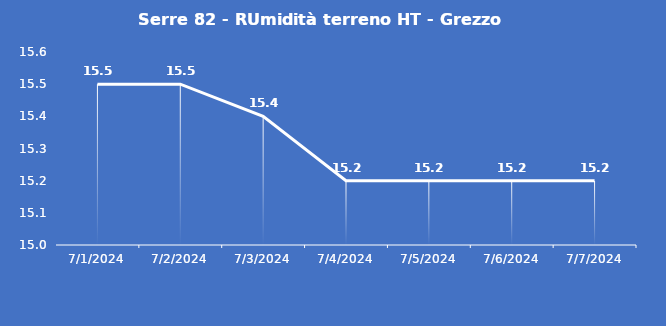
| Category | Serre 82 - RUmidità terreno HT - Grezzo (%VWC) |
|---|---|
| 7/1/24 | 15.5 |
| 7/2/24 | 15.5 |
| 7/3/24 | 15.4 |
| 7/4/24 | 15.2 |
| 7/5/24 | 15.2 |
| 7/6/24 | 15.2 |
| 7/7/24 | 15.2 |